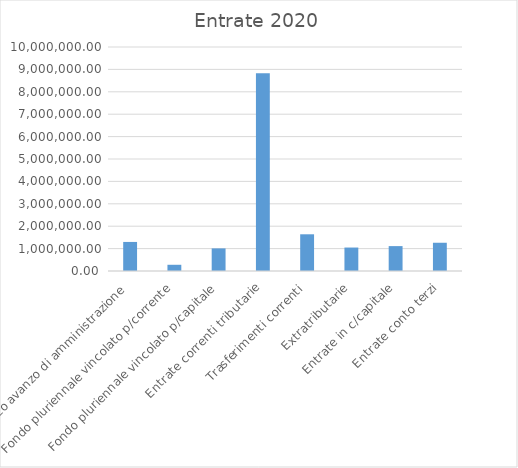
| Category | Series 0 |
|---|---|
| Utilizzo avanzo di amministrazione | 1297086.65 |
| Fondo pluriennale vincolato p/corrente | 277817.42 |
| Fondo pluriennale vincolato p/capitale | 1009407.63 |
| Entrate correnti tributarie | 8823249.88 |
| Trasferimenti correnti | 1638685.3 |
| Extratributarie | 1047193.05 |
| Entrate in c/capitale | 1111194 |
| Entrate conto terzi | 1261203.74 |